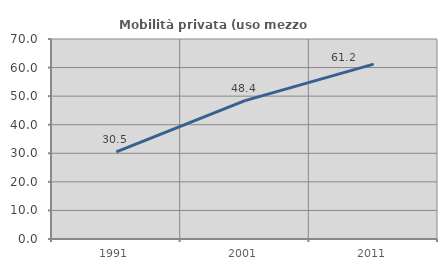
| Category | Mobilità privata (uso mezzo privato) |
|---|---|
| 1991.0 | 30.461 |
| 2001.0 | 48.436 |
| 2011.0 | 61.212 |